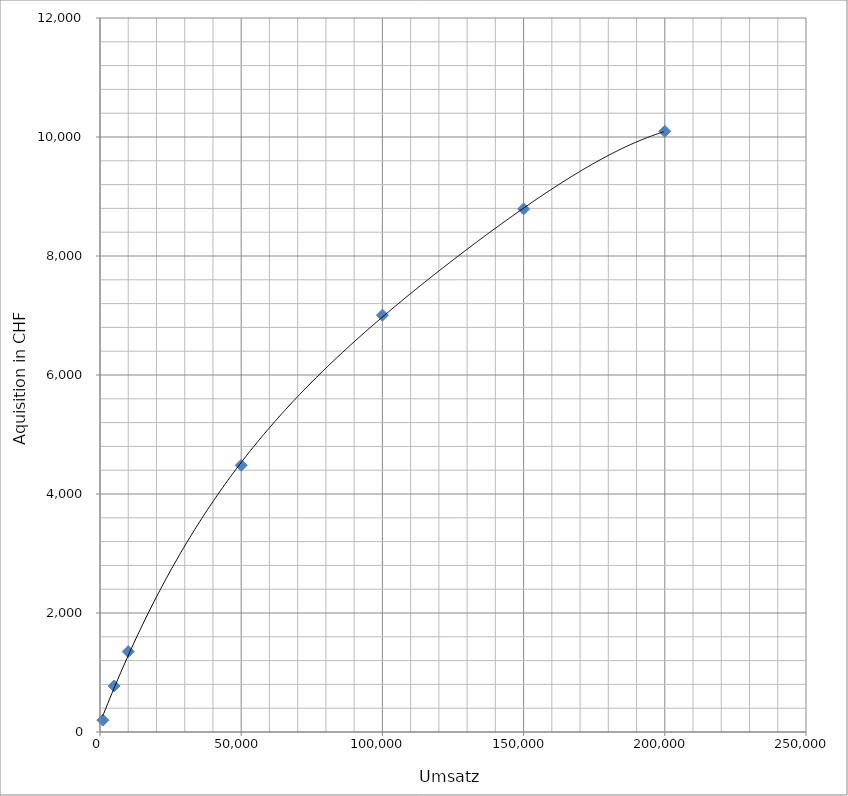
| Category | Series 0 |
|---|---|
| 1000.0 | 200.156 |
| 5000.0 | 773.446 |
| 10000.0 | 1351.079 |
| 50000.0 | 4482.063 |
| 100000.0 | 7005.986 |
| 150000.0 | 8790.82 |
| 200000.0 | 10095.69 |